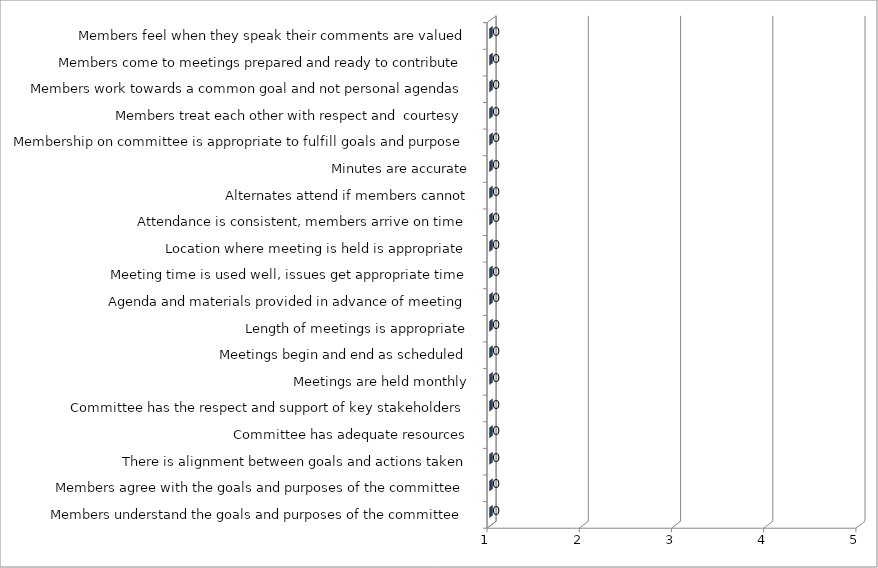
| Category | Series 0 |
|---|---|
| Members understand the goals and purposes of the committee | 0 |
| Members agree with the goals and purposes of the committee | 0 |
| There is alignment between goals and actions taken | 0 |
| Committee has adequate resources | 0 |
| Committee has the respect and support of key stakeholders | 0 |
| Meetings are held monthly | 0 |
| Meetings begin and end as scheduled | 0 |
| Length of meetings is appropriate | 0 |
| Agenda and materials provided in advance of meeting | 0 |
| Meeting time is used well, issues get appropriate time | 0 |
| Location where meeting is held is appropriate | 0 |
| Attendance is consistent, members arrive on time | 0 |
| Alternates attend if members cannot | 0 |
| Minutes are accurate | 0 |
| Membership on committee is appropriate to fulfill goals and purpose | 0 |
| Members treat each other with respect and  courtesy | 0 |
| Members work towards a common goal and not personal agendas | 0 |
| Members come to meetings prepared and ready to contribute | 0 |
| Members feel when they speak their comments are valued | 0 |